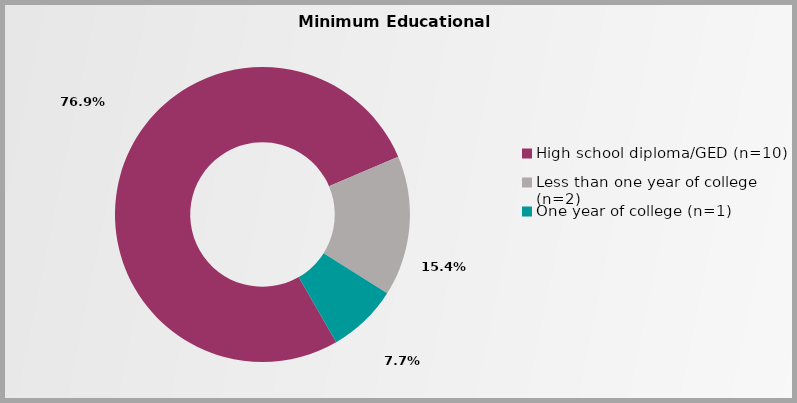
| Category | Series 0 |
|---|---|
| High school diploma/GED (n=10) | 10 |
| Less than one year of college (n=2) | 2 |
| One year of college (n=1) | 1 |